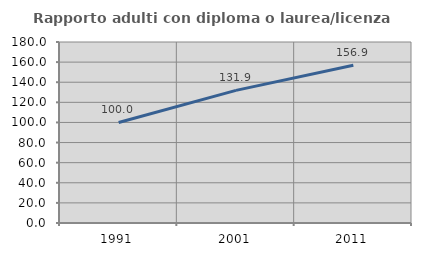
| Category | Rapporto adulti con diploma o laurea/licenza media  |
|---|---|
| 1991.0 | 100 |
| 2001.0 | 131.884 |
| 2011.0 | 156.923 |